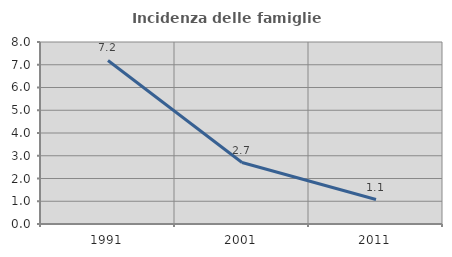
| Category | Incidenza delle famiglie numerose |
|---|---|
| 1991.0 | 7.19 |
| 2001.0 | 2.703 |
| 2011.0 | 1.075 |